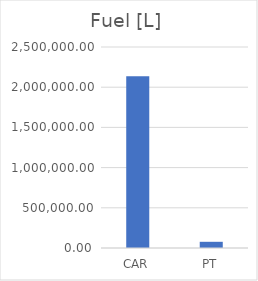
| Category | Series 0 |
|---|---|
| CAR | 2135520.45 |
| PT | 77112 |